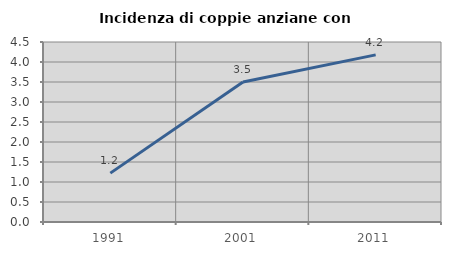
| Category | Incidenza di coppie anziane con figli |
|---|---|
| 1991.0 | 1.222 |
| 2001.0 | 3.5 |
| 2011.0 | 4.179 |